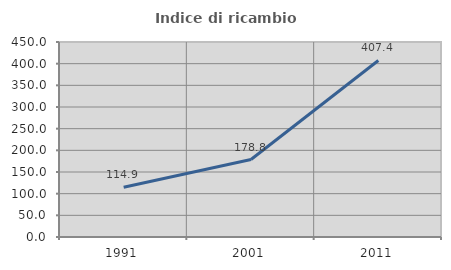
| Category | Indice di ricambio occupazionale  |
|---|---|
| 1991.0 | 114.939 |
| 2001.0 | 178.814 |
| 2011.0 | 407.407 |